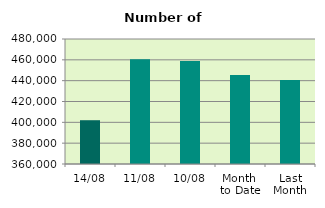
| Category | Series 0 |
|---|---|
| 14/08 | 402038 |
| 11/08 | 460666 |
| 10/08 | 458796 |
| Month 
to Date | 445430 |
| Last
Month | 440756.667 |